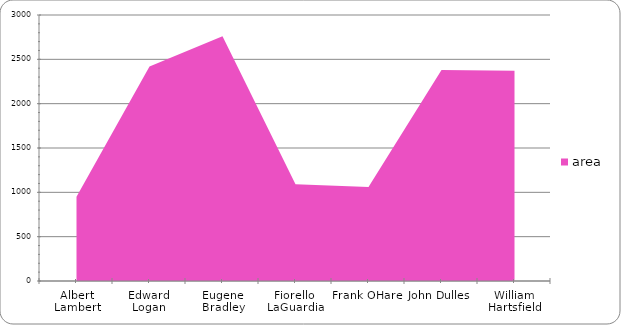
| Category | area |
|---|---|
| Albert Lambert | 950 |
| Edward Logan | 2420 |
| Eugene Bradley | 2760 |
| Fiorello LaGuardia | 1090 |
| Frank OHare | 1060 |
| John Dulles | 2380 |
| William Hartsfield | 2370 |